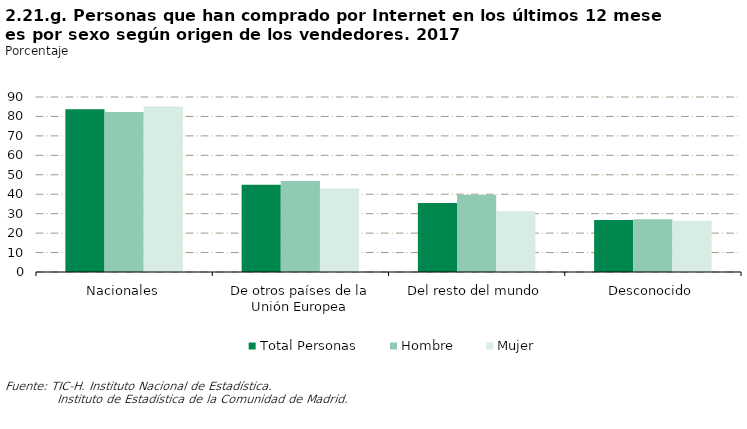
| Category | Total Personas | Hombre | Mujer |
|---|---|---|---|
| Nacionales | 83.719 | 82.311 | 85.107 |
| De otros países de la Unión Europea | 44.846 | 46.791 | 42.927 |
| Del resto del mundo | 35.485 | 39.75 | 31.278 |
| Desconocido | 26.753 | 27.135 | 26.376 |